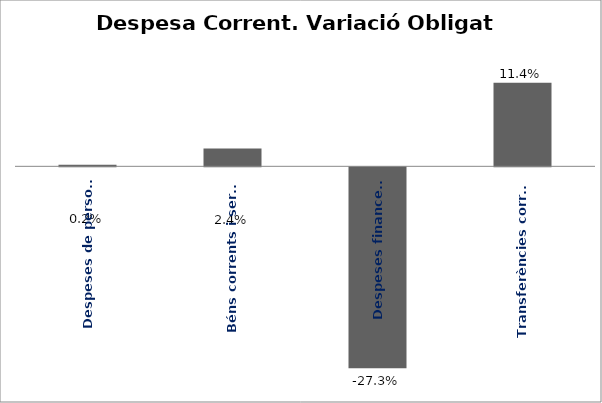
| Category | Series 0 |
|---|---|
| Despeses de personal | 0.002 |
| Béns corrents i serveis | 0.024 |
| Despeses financeres | -0.273 |
| Transferències corrents | 0.114 |